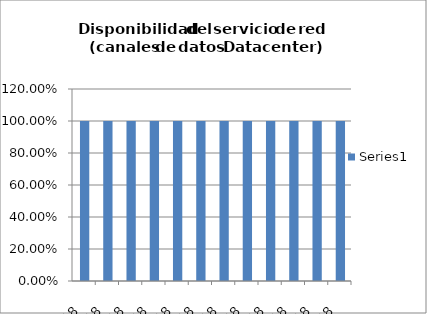
| Category | Series 0 |
|---|---|
| 2018-01-01 | 1 |
| 2018-02-01 | 1 |
| 2018-03-01 | 1 |
| 2018-04-01 | 1 |
| 2018-05-01 | 1 |
| 2018-06-01 | 1 |
| 2018-07-01 | 1 |
| 2018-08-01 | 1 |
| 2018-09-01 | 1 |
| 2018-10-01 | 1 |
| 2018-11-01 | 1 |
| 2018-12-01 | 1 |